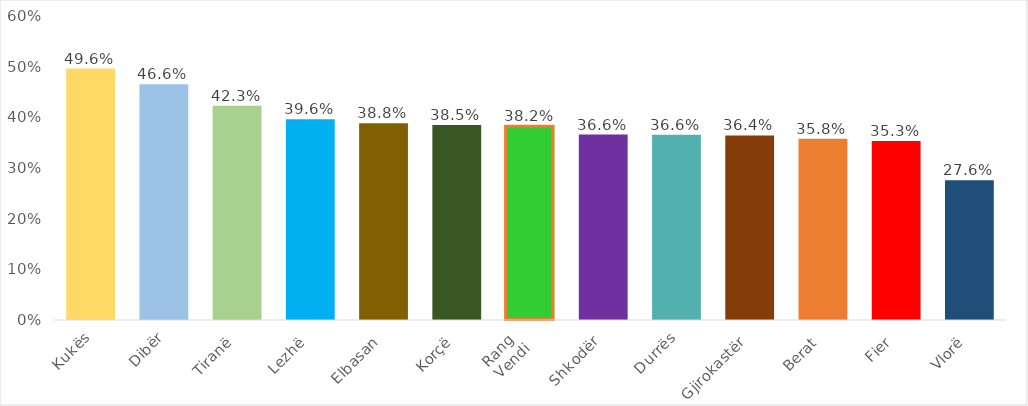
| Category | Pjesëmarrja në % |
|---|---|
| Kukës | 0.496 |
| Dibër | 0.466 |
| Tiranë | 0.423 |
| Lezhë | 0.396 |
| Elbasan | 0.388 |
| Korçë | 0.385 |
| Rang 
Vendi | 0.382 |
| Shkodër | 0.366 |
| Durrës | 0.366 |
| Gjirokastër | 0.364 |
| Berat | 0.358 |
| Fier | 0.353 |
| Vlorë | 0.276 |